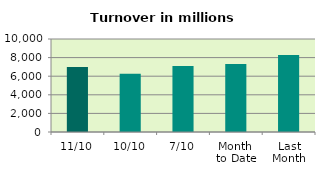
| Category | Series 0 |
|---|---|
| 11/10 | 6997.179 |
| 10/10 | 6254.044 |
| 7/10 | 7086.078 |
| Month 
to Date | 7318.966 |
| Last
Month | 8284.199 |